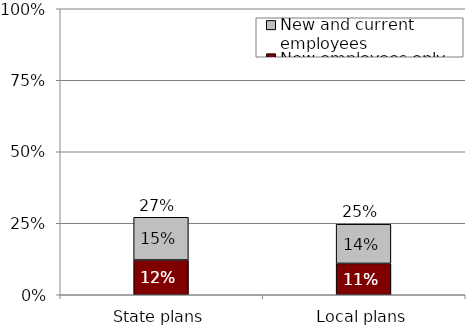
| Category | New employees only | New and current employees |
|---|---|---|
| 0 | 0.121 | 0.15 |
| 1 | 0.11 | 0.137 |